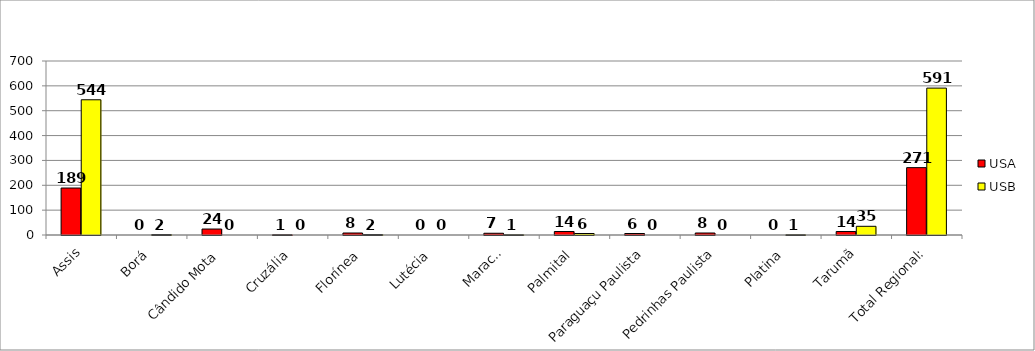
| Category | USA | USB |
|---|---|---|
| Assis | 189 | 544 |
| Borá | 0 | 2 |
| Cândido Mota | 24 | 0 |
| Cruzália | 1 | 0 |
| Florínea | 8 | 2 |
| Lutécia | 0 | 0 |
| Maracaí | 7 | 1 |
| Palmital | 14 | 6 |
| Paraguaçu Paulista | 6 | 0 |
| Pedrinhas Paulista | 8 | 0 |
| Platina | 0 | 1 |
| Tarumã | 14 | 35 |
| Total Regional: | 271 | 591 |